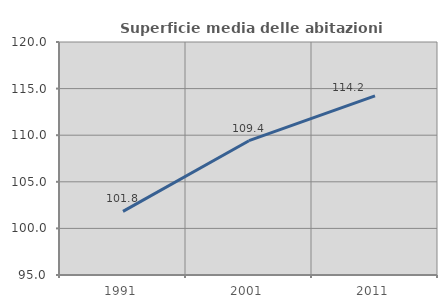
| Category | Superficie media delle abitazioni occupate |
|---|---|
| 1991.0 | 101.827 |
| 2001.0 | 109.41 |
| 2011.0 | 114.211 |